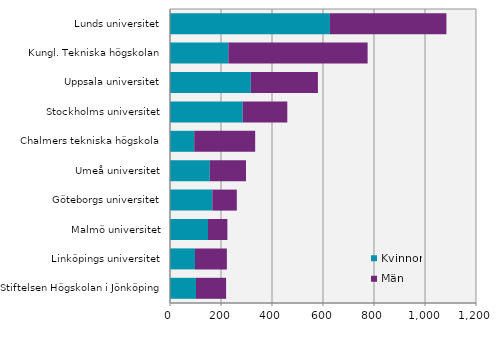
| Category | Kvinnor | Män  |
|---|---|---|
| Lunds universitet | 627 | 457 |
| Kungl. Tekniska högskolan | 229 | 546 |
| Uppsala universitet | 317 | 263 |
| Stockholms universitet | 285 | 175 |
| Chalmers tekniska högskola | 95 | 239 |
| Umeå universitet | 156 | 142 |
| Göteborgs universitet | 166 | 96 |
| Malmö universitet | 149 | 76 |
| Linköpings universitet | 98 | 125 |
| Stiftelsen Högskolan i Jönköping | 102 | 118 |